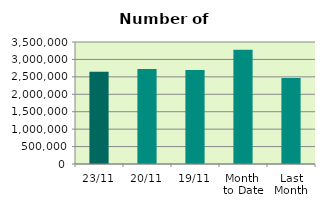
| Category | Series 0 |
|---|---|
| 23/11 | 2645124 |
| 20/11 | 2722274 |
| 19/11 | 2693592 |
| Month 
to Date | 3278292.125 |
| Last
Month | 2465363.545 |